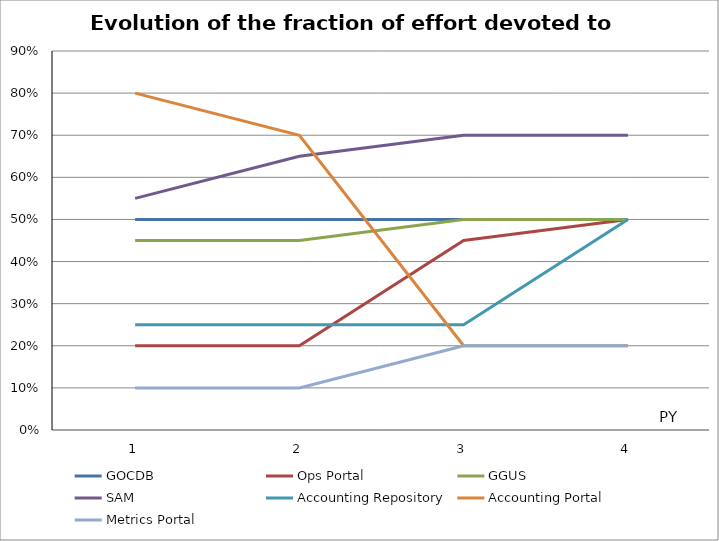
| Category | GOCDB | Ops Portal | GGUS | SAM | Accounting Repository | Accounting Portal | Metrics Portal |
|---|---|---|---|---|---|---|---|
| 0 | 0.5 | 0.2 | 0.45 | 0.55 | 0.25 | 0.8 | 0.1 |
| 1 | 0.5 | 0.2 | 0.45 | 0.65 | 0.25 | 0.7 | 0.1 |
| 2 | 0.5 | 0.45 | 0.5 | 0.7 | 0.25 | 0.2 | 0.2 |
| 3 | 0.5 | 0.5 | 0.5 | 0.7 | 0.5 | 0.2 | 0.2 |